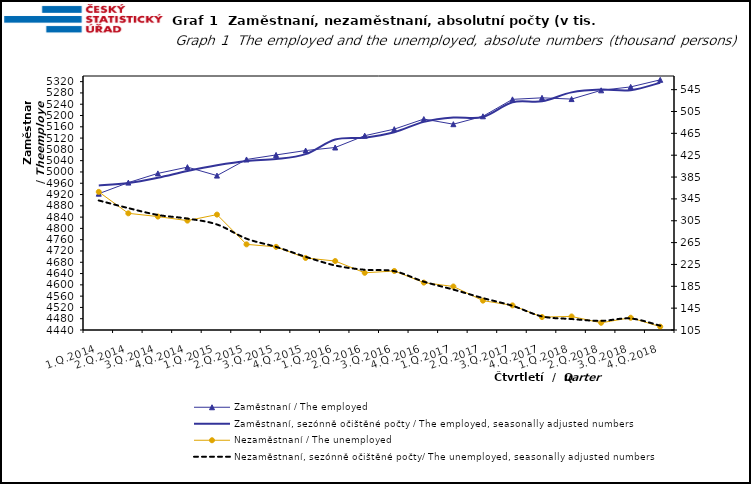
| Category | Zaměstnaní / The employed | Zaměstnaní, sezónně očištěné počty / The employed, seasonally adjusted numbers |
|---|---|---|
| 1.Q.2014 | 4922.963 | 4952.405 |
| 2.Q.2014 | 4962.219 | 4960.65 |
| 3.Q.2014 | 4994.947 | 4979.618 |
| 4.Q.2014 | 5017.051 | 5003.629 |
| 1.Q.2015 | 4987.141 | 5023.827 |
| 2.Q.2015 | 5044.285 | 5038.984 |
| 3.Q.2015 | 5060.3 | 5045.647 |
| 4.Q.2015 | 5075.884 | 5063.085 |
| 1.Q.2016 | 5086.671 | 5114.698 |
| 2.Q.2016 | 5128.493 | 5121.602 |
| 3.Q.2016 | 5151.712 | 5140.967 |
| 4.Q.2016 | 5187.436 | 5177.35 |
| 1.Q.2017 | 5169.203 | 5192.941 |
| 2.Q.2017 | 5197.265 | 5194.555 |
| 3.Q.2017 | 5257.26 | 5246.726 |
| 4.Q.2017 | 5262.691 | 5250.237 |
| 1.Q.2018 | 5258.225 | 5281.99 |
| 2.Q.2018 | 5289.242 | 5291.982 |
| 3.Q.2018 | 5301.361 | 5289.641 |
| 4.Q.2018 | 5326.327 | 5316.128 |